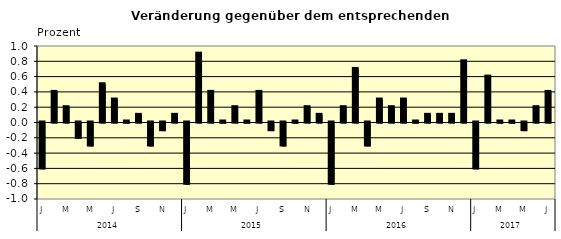
| Category | Series 0 |
|---|---|
| 0 | -0.6 |
| 1 | 0.4 |
| 2 | 0.2 |
| 3 | -0.2 |
| 4 | -0.3 |
| 5 | 0.5 |
| 6 | 0.3 |
| 7 | 0.01 |
| 8 | 0.1 |
| 9 | -0.3 |
| 10 | -0.1 |
| 11 | 0.1 |
| 12 | -0.8 |
| 13 | 0.9 |
| 14 | 0.4 |
| 15 | 0.01 |
| 16 | 0.2 |
| 17 | 0.01 |
| 18 | 0.4 |
| 19 | -0.1 |
| 20 | -0.3 |
| 21 | 0.01 |
| 22 | 0.2 |
| 23 | 0.1 |
| 24 | -0.8 |
| 25 | 0.2 |
| 26 | 0.7 |
| 27 | -0.3 |
| 28 | 0.3 |
| 29 | 0.2 |
| 30 | 0.3 |
| 31 | 0.01 |
| 32 | 0.1 |
| 33 | 0.1 |
| 34 | 0.1 |
| 35 | 0.8 |
| 36 | -0.6 |
| 37 | 0.6 |
| 38 | 0.01 |
| 39 | 0.01 |
| 40 | -0.1 |
| 41 | 0.2 |
| 42 | 0.4 |